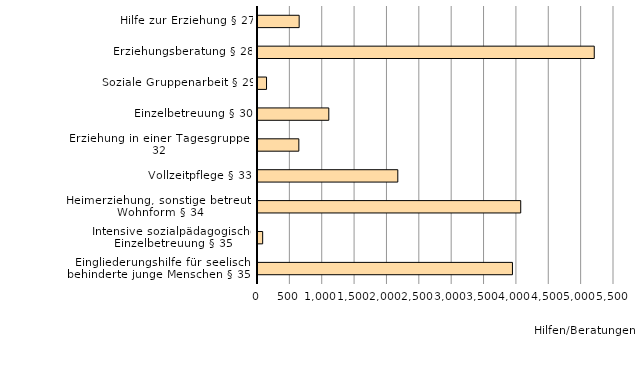
| Category | Series 0 |
|---|---|
| Eingliederungshilfe für seelisch
behinderte junge Menschen § 35a | 3931 |
| Intensive sozialpädagogische Einzelbetreuung § 35 | 72 |
| Heimerziehung, sonstige betreute Wohnform § 34 | 4059 |
| Vollzeitpflege § 33 | 2160 |
| Erziehung in einer Tagesgruppe § 32 | 631 |
| Einzelbetreuung § 30 | 1094 |
| Soziale Gruppenarbeit § 29 | 132 |
| Erziehungsberatung § 28 | 5195 |
| Hilfe zur Erziehung § 27 | 636 |